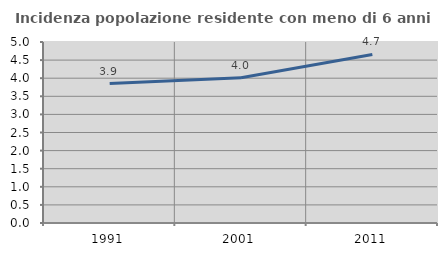
| Category | Incidenza popolazione residente con meno di 6 anni |
|---|---|
| 1991.0 | 3.851 |
| 2001.0 | 4.01 |
| 2011.0 | 4.656 |